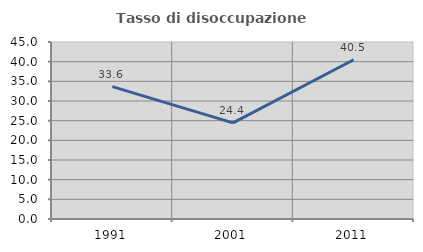
| Category | Tasso di disoccupazione giovanile  |
|---|---|
| 1991.0 | 33.645 |
| 2001.0 | 24.444 |
| 2011.0 | 40.476 |